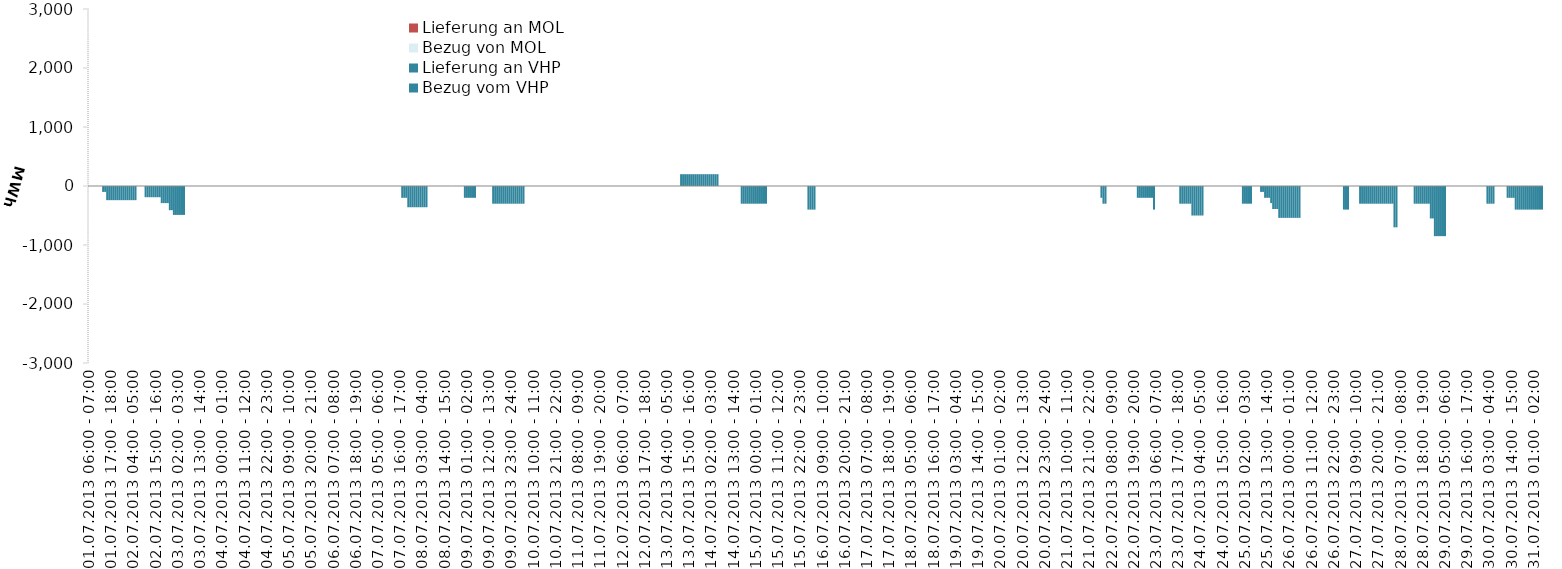
| Category | Bezug vom VHP | Lieferung an VHP | Bezug von MOL | Lieferung an MOL |
|---|---|---|---|---|
| 01.07.2013 06:00 - 07:00 | 0 | 0 | 0 | 0 |
| 01.07.2013 07:00 - 08:00 | 0 | 0 | 0 | 0 |
| 01.07.2013 08:00 - 09:00 | 0 | 0 | 0 | 0 |
| 01.07.2013 09:00 - 10:00 | 0 | 0 | 0 | 0 |
| 01.07.2013 10:00 - 11:00 | 0 | 0 | 0 | 0 |
| 01.07.2013 11:00 - 12:00 | 0 | 0 | 0 | 0 |
| 01.07.2013 12:00 - 13:00 | 0 | 0 | 0 | 0 |
| 01.07.2013 13:00 - 14:00 | 0 | -100 | 0 | 0 |
| 01.07.2013 14:00 - 15:00 | 0 | -100 | 0 | 0 |
| 01.07.2013 15:00 - 16:00 | 0 | -240 | 0 | 0 |
| 01.07.2013 16:00 - 17:00 | 0 | -240 | 0 | 0 |
| 01.07.2013 17:00 - 18:00 | 0 | -240 | 0 | 0 |
| 01.07.2013 18:00 - 19:00 | 0 | -240 | 0 | 0 |
| 01.07.2013 19:00 - 20:00 | 0 | -240 | 0 | 0 |
| 01.07.2013 20:00 - 21:00 | 0 | -240 | 0 | 0 |
| 01.07.2013 21:00 - 22:00 | 0 | -240 | 0 | 0 |
| 01.07.2013 22:00 - 23:00 | 0 | -240 | 0 | 0 |
| 01.07.2013 23:00 - 24:00 | 0 | -240 | 0 | 0 |
| 02.07.2013 00:00 - 01:00 | 0 | -240 | 0 | 0 |
| 02.07.2013 01:00 - 02:00 | 0 | -240 | 0 | 0 |
| 02.07.2013 02:00 - 03:00 | 0 | -240 | 0 | 0 |
| 02.07.2013 03:00 - 04:00 | 0 | -240 | 0 | 0 |
| 02.07.2013 04:00 - 05:00 | 0 | -240 | 0 | 0 |
| 02.07.2013 05:00 - 06:00 | 0 | -240 | 0 | 0 |
| 02.07.2013 06:00 - 07:00 | 0 | 0 | 0 | 0 |
| 02.07.2013 07:00 - 08:00 | 0 | 0 | 0 | 0 |
| 02.07.2013 08:00 - 09:00 | 0 | 0 | 0 | 0 |
| 02.07.2013 09:00 - 10:00 | 0 | 0 | 0 | 0 |
| 02.07.2013 10:00 - 11:00 | 0 | -190 | 0 | 0 |
| 02.07.2013 11:00 - 12:00 | 0 | -190 | 0 | 0 |
| 02.07.2013 12:00 - 13:00 | 0 | -190 | 0 | 0 |
| 02.07.2013 13:00 - 14:00 | 0 | -190 | 0 | 0 |
| 02.07.2013 14:00 - 15:00 | 0 | -190 | 0 | 0 |
| 02.07.2013 15:00 - 16:00 | 0 | -190 | 0 | 0 |
| 02.07.2013 16:00 - 17:00 | 0 | -190 | 0 | 0 |
| 02.07.2013 17:00 - 18:00 | 0 | -190 | 0 | 0 |
| 02.07.2013 18:00 - 19:00 | 0 | -290 | 0 | 0 |
| 02.07.2013 19:00 - 20:00 | 0 | -290 | 0 | 0 |
| 02.07.2013 20:00 - 21:00 | 0 | -290 | 0 | 0 |
| 02.07.2013 21:00 - 22:00 | 0 | -290 | 0 | 0 |
| 02.07.2013 22:00 - 23:00 | 0 | -410 | 0 | 0 |
| 02.07.2013 23:00 - 24:00 | 0 | -410 | 0 | 0 |
| 03.07.2013 00:00 - 01:00 | 0 | -490 | 0 | 0 |
| 03.07.2013 01:00 - 02:00 | 0 | -490 | 0 | 0 |
| 03.07.2013 02:00 - 03:00 | 0 | -490 | 0 | 0 |
| 03.07.2013 03:00 - 04:00 | 0 | -490 | 0 | 0 |
| 03.07.2013 04:00 - 05:00 | 0 | -490 | 0 | 0 |
| 03.07.2013 05:00 - 06:00 | 0 | -490 | 0 | 0 |
| 03.07.2013 06:00 - 07:00 | 0 | 0 | 0 | 0 |
| 03.07.2013 07:00 - 08:00 | 0 | 0 | 0 | 0 |
| 03.07.2013 08:00 - 09:00 | 0 | 0 | 0 | 0 |
| 03.07.2013 09:00 - 10:00 | 0 | 0 | 0 | 0 |
| 03.07.2013 10:00 - 11:00 | 0 | 0 | 0 | 0 |
| 03.07.2013 11:00 - 12:00 | 0 | 0 | 0 | 0 |
| 03.07.2013 12:00 - 13:00 | 0 | 0 | 0 | 0 |
| 03.07.2013 13:00 - 14:00 | 0 | 0 | 0 | 0 |
| 03.07.2013 14:00 - 15:00 | 0 | 0 | 0 | 0 |
| 03.07.2013 15:00 - 16:00 | 0 | 0 | 0 | 0 |
| 03.07.2013 16:00 - 17:00 | 0 | 0 | 0 | 0 |
| 03.07.2013 17:00 - 18:00 | 0 | 0 | 0 | 0 |
| 03.07.2013 18:00 - 19:00 | 0 | 0 | 0 | 0 |
| 03.07.2013 19:00 - 20:00 | 0 | 0 | 0 | 0 |
| 03.07.2013 20:00 - 21:00 | 0 | 0 | 0 | 0 |
| 03.07.2013 21:00 - 22:00 | 0 | 0 | 0 | 0 |
| 03.07.2013 22:00 - 23:00 | 0 | 0 | 0 | 0 |
| 03.07.2013 23:00 - 24:00 | 0 | 0 | 0 | 0 |
| 04.07.2013 00:00 - 01:00 | 0 | 0 | 0 | 0 |
| 04.07.2013 01:00 - 02:00 | 0 | 0 | 0 | 0 |
| 04.07.2013 02:00 - 03:00 | 0 | 0 | 0 | 0 |
| 04.07.2013 03:00 - 04:00 | 0 | 0 | 0 | 0 |
| 04.07.2013 04:00 - 05:00 | 0 | 0 | 0 | 0 |
| 04.07.2013 05:00 - 06:00 | 0 | 0 | 0 | 0 |
| 04.07.2013 06:00 - 07:00 | 0 | 0 | 0 | 0 |
| 04.07.2013 07:00 - 08:00 | 0 | 0 | 0 | 0 |
| 04.07.2013 08:00 - 09:00 | 0 | 0 | 0 | 0 |
| 04.07.2013 09:00 - 10:00 | 0 | 0 | 0 | 0 |
| 04.07.2013 10:00 - 11:00 | 0 | 0 | 0 | 0 |
| 04.07.2013 11:00 - 12:00 | 0 | 0 | 0 | 0 |
| 04.07.2013 12:00 - 13:00 | 0 | 0 | 0 | 0 |
| 04.07.2013 13:00 - 14:00 | 0 | 0 | 0 | 0 |
| 04.07.2013 14:00 - 15:00 | 0 | 0 | 0 | 0 |
| 04.07.2013 15:00 - 16:00 | 0 | 0 | 0 | 0 |
| 04.07.2013 16:00 - 17:00 | 0 | 0 | 0 | 0 |
| 04.07.2013 17:00 - 18:00 | 0 | 0 | 0 | 0 |
| 04.07.2013 18:00 - 19:00 | 0 | 0 | 0 | 0 |
| 04.07.2013 19:00 - 20:00 | 0 | 0 | 0 | 0 |
| 04.07.2013 20:00 - 21:00 | 0 | 0 | 0 | 0 |
| 04.07.2013 21:00 - 22:00 | 0 | 0 | 0 | 0 |
| 04.07.2013 22:00 - 23:00 | 0 | 0 | 0 | 0 |
| 04.07.2013 23:00 - 24:00 | 0 | 0 | 0 | 0 |
| 05.07.2013 00:00 - 01:00 | 0 | 0 | 0 | 0 |
| 05.07.2013 01:00 - 02:00 | 0 | 0 | 0 | 0 |
| 05.07.2013 02:00 - 03:00 | 0 | 0 | 0 | 0 |
| 05.07.2013 03:00 - 04:00 | 0 | 0 | 0 | 0 |
| 05.07.2013 04:00 - 05:00 | 0 | 0 | 0 | 0 |
| 05.07.2013 05:00 - 06:00 | 0 | 0 | 0 | 0 |
| 05.07.2013 06:00 - 07:00 | 0 | 0 | 0 | 0 |
| 05.07.2013 07:00 - 08:00 | 0 | 0 | 0 | 0 |
| 05.07.2013 08:00 - 09:00 | 0 | 0 | 0 | 0 |
| 05.07.2013 09:00 - 10:00 | 0 | 0 | 0 | 0 |
| 05.07.2013 10:00 - 11:00 | 0 | 0 | 0 | 0 |
| 05.07.2013 11:00 - 12:00 | 0 | 0 | 0 | 0 |
| 05.07.2013 12:00 - 13:00 | 0 | 0 | 0 | 0 |
| 05.07.2013 13:00 - 14:00 | 0 | 0 | 0 | 0 |
| 05.07.2013 14:00 - 15:00 | 0 | 0 | 0 | 0 |
| 05.07.2013 15:00 - 16:00 | 0 | 0 | 0 | 0 |
| 05.07.2013 16:00 - 17:00 | 0 | 0 | 0 | 0 |
| 05.07.2013 17:00 - 18:00 | 0 | 0 | 0 | 0 |
| 05.07.2013 18:00 - 19:00 | 0 | 0 | 0 | 0 |
| 05.07.2013 19:00 - 20:00 | 0 | 0 | 0 | 0 |
| 05.07.2013 20:00 - 21:00 | 0 | 0 | 0 | 0 |
| 05.07.2013 21:00 - 22:00 | 0 | 0 | 0 | 0 |
| 05.07.2013 22:00 - 23:00 | 0 | 0 | 0 | 0 |
| 05.07.2013 23:00 - 24:00 | 0 | 0 | 0 | 0 |
| 06.07.2013 00:00 - 01:00 | 0 | 0 | 0 | 0 |
| 06.07.2013 01:00 - 02:00 | 0 | 0 | 0 | 0 |
| 06.07.2013 02:00 - 03:00 | 0 | 0 | 0 | 0 |
| 06.07.2013 03:00 - 04:00 | 0 | 0 | 0 | 0 |
| 06.07.2013 04:00 - 05:00 | 0 | 0 | 0 | 0 |
| 06.07.2013 05:00 - 06:00 | 0 | 0 | 0 | 0 |
| 06.07.2013 06:00 - 07:00 | 0 | 0 | 0 | 0 |
| 06.07.2013 07:00 - 08:00 | 0 | 0 | 0 | 0 |
| 06.07.2013 08:00 - 09:00 | 0 | 0 | 0 | 0 |
| 06.07.2013 09:00 - 10:00 | 0 | 0 | 0 | 0 |
| 06.07.2013 10:00 - 11:00 | 0 | 0 | 0 | 0 |
| 06.07.2013 11:00 - 12:00 | 0 | 0 | 0 | 0 |
| 06.07.2013 12:00 - 13:00 | 0 | 0 | 0 | 0 |
| 06.07.2013 13:00 - 14:00 | 0 | 0 | 0 | 0 |
| 06.07.2013 14:00 - 15:00 | 0 | 0 | 0 | 0 |
| 06.07.2013 15:00 - 16:00 | 0 | 0 | 0 | 0 |
| 06.07.2013 16:00 - 17:00 | 0 | 0 | 0 | 0 |
| 06.07.2013 17:00 - 18:00 | 0 | 0 | 0 | 0 |
| 06.07.2013 18:00 - 19:00 | 0 | 0 | 0 | 0 |
| 06.07.2013 19:00 - 20:00 | 0 | 0 | 0 | 0 |
| 06.07.2013 20:00 - 21:00 | 0 | 0 | 0 | 0 |
| 06.07.2013 21:00 - 22:00 | 0 | 0 | 0 | 0 |
| 06.07.2013 22:00 - 23:00 | 0 | 0 | 0 | 0 |
| 06.07.2013 23:00 - 24:00 | 0 | 0 | 0 | 0 |
| 07.07.2013 00:00 - 01:00 | 0 | 0 | 0 | 0 |
| 07.07.2013 01:00 - 02:00 | 0 | 0 | 0 | 0 |
| 07.07.2013 02:00 - 03:00 | 0 | 0 | 0 | 0 |
| 07.07.2013 03:00 - 04:00 | 0 | 0 | 0 | 0 |
| 07.07.2013 04:00 - 05:00 | 0 | 0 | 0 | 0 |
| 07.07.2013 05:00 - 06:00 | 0 | 0 | 0 | 0 |
| 07.07.2013 06:00 - 07:00 | 0 | 0 | 0 | 0 |
| 07.07.2013 07:00 - 08:00 | 0 | 0 | 0 | 0 |
| 07.07.2013 08:00 - 09:00 | 0 | 0 | 0 | 0 |
| 07.07.2013 09:00 - 10:00 | 0 | 0 | 0 | 0 |
| 07.07.2013 10:00 - 11:00 | 0 | 0 | 0 | 0 |
| 07.07.2013 11:00 - 12:00 | 0 | 0 | 0 | 0 |
| 07.07.2013 12:00 - 13:00 | 0 | 0 | 0 | 0 |
| 07.07.2013 13:00 - 14:00 | 0 | 0 | 0 | 0 |
| 07.07.2013 14:00 - 15:00 | 0 | 0 | 0 | 0 |
| 07.07.2013 15:00 - 16:00 | 0 | 0 | 0 | 0 |
| 07.07.2013 16:00 - 17:00 | 0 | 0 | 0 | 0 |
| 07.07.2013 17:00 - 18:00 | 0 | -200 | 0 | 0 |
| 07.07.2013 18:00 - 19:00 | 0 | -200 | 0 | 0 |
| 07.07.2013 19:00 - 20:00 | 0 | -200 | 0 | 0 |
| 07.07.2013 20:00 - 21:00 | 0 | -360 | 0 | 0 |
| 07.07.2013 21:00 - 22:00 | 0 | -360 | 0 | 0 |
| 07.07.2013 22:00 - 23:00 | 0 | -360 | 0 | 0 |
| 07.07.2013 23:00 - 24:00 | 0 | -360 | 0 | 0 |
| 08.07.2013 00:00 - 01:00 | 0 | -360 | 0 | 0 |
| 08.07.2013 01:00 - 02:00 | 0 | -360 | 0 | 0 |
| 08.07.2013 02:00 - 03:00 | 0 | -360 | 0 | 0 |
| 08.07.2013 03:00 - 04:00 | 0 | -360 | 0 | 0 |
| 08.07.2013 04:00 - 05:00 | 0 | -360 | 0 | 0 |
| 08.07.2013 05:00 - 06:00 | 0 | -360 | 0 | 0 |
| 08.07.2013 06:00 - 07:00 | 0 | 0 | 0 | 0 |
| 08.07.2013 07:00 - 08:00 | 0 | 0 | 0 | 0 |
| 08.07.2013 08:00 - 09:00 | 0 | 0 | 0 | 0 |
| 08.07.2013 09:00 - 10:00 | 0 | 0 | 0 | 0 |
| 08.07.2013 10:00 - 11:00 | 0 | 0 | 0 | 0 |
| 08.07.2013 11:00 - 12:00 | 0 | 0 | 0 | 0 |
| 08.07.2013 12:00 - 13:00 | 0 | 0 | 0 | 0 |
| 08.07.2013 13:00 - 14:00 | 0 | 0 | 0 | 0 |
| 08.07.2013 14:00 - 15:00 | 0 | 0 | 0 | 0 |
| 08.07.2013 15:00 - 16:00 | 0 | 0 | 0 | 0 |
| 08.07.2013 16:00 - 17:00 | 0 | 0 | 0 | 0 |
| 08.07.2013 17:00 - 18:00 | 0 | 0 | 0 | 0 |
| 08.07.2013 18:00 - 19:00 | 0 | 0 | 0 | 0 |
| 08.07.2013 19:00 - 20:00 | 0 | 0 | 0 | 0 |
| 08.07.2013 20:00 - 21:00 | 0 | 0 | 0 | 0 |
| 08.07.2013 21:00 - 22:00 | 0 | 0 | 0 | 0 |
| 08.07.2013 22:00 - 23:00 | 0 | 0 | 0 | 0 |
| 08.07.2013 23:00 - 24:00 | 0 | 0 | 0 | 0 |
| 09.07.2013 00:00 - 01:00 | 0 | -200 | 0 | 0 |
| 09.07.2013 01:00 - 02:00 | 0 | -200 | 0 | 0 |
| 09.07.2013 02:00 - 03:00 | 0 | -200 | 0 | 0 |
| 09.07.2013 03:00 - 04:00 | 0 | -200 | 0 | 0 |
| 09.07.2013 04:00 - 05:00 | 0 | -200 | 0 | 0 |
| 09.07.2013 05:00 - 06:00 | 0 | -200 | 0 | 0 |
| 09.07.2013 06:00 - 07:00 | 0 | 0 | 0 | 0 |
| 09.07.2013 07:00 - 08:00 | 0 | 0 | 0 | 0 |
| 09.07.2013 08:00 - 09:00 | 0 | 0 | 0 | 0 |
| 09.07.2013 09:00 - 10:00 | 0 | 0 | 0 | 0 |
| 09.07.2013 10:00 - 11:00 | 0 | 0 | 0 | 0 |
| 09.07.2013 11:00 - 12:00 | 0 | 0 | 0 | 0 |
| 09.07.2013 12:00 - 13:00 | 0 | 0 | 0 | 0 |
| 09.07.2013 13:00 - 14:00 | 0 | 0 | 0 | 0 |
| 09.07.2013 14:00 - 15:00 | 0 | -300 | 0 | 0 |
| 09.07.2013 15:00 - 16:00 | 0 | -300 | 0 | 0 |
| 09.07.2013 16:00 - 17:00 | 0 | -300 | 0 | 0 |
| 09.07.2013 17:00 - 18:00 | 0 | -300 | 0 | 0 |
| 09.07.2013 18:00 - 19:00 | 0 | -300 | 0 | 0 |
| 09.07.2013 19:00 - 20:00 | 0 | -300 | 0 | 0 |
| 09.07.2013 20:00 - 21:00 | 0 | -300 | 0 | 0 |
| 09.07.2013 21:00 - 22:00 | 0 | -300 | 0 | 0 |
| 09.07.2013 22:00 - 23:00 | 0 | -300 | 0 | 0 |
| 09.07.2013 23:00 - 24:00 | 0 | -300 | 0 | 0 |
| 10.07.2013 00:00 - 01:00 | 0 | -300 | 0 | 0 |
| 10.07.2013 01:00 - 02:00 | 0 | -300 | 0 | 0 |
| 10.07.2013 02:00 - 03:00 | 0 | -300 | 0 | 0 |
| 10.07.2013 03:00 - 04:00 | 0 | -300 | 0 | 0 |
| 10.07.2013 04:00 - 05:00 | 0 | -300 | 0 | 0 |
| 10.07.2013 05:00 - 06:00 | 0 | -300 | 0 | 0 |
| 10.07.2013 06:00 - 07:00 | 0 | 0 | 0 | 0 |
| 10.07.2013 07:00 - 08:00 | 0 | 0 | 0 | 0 |
| 10.07.2013 08:00 - 09:00 | 0 | 0 | 0 | 0 |
| 10.07.2013 09:00 - 10:00 | 0 | 0 | 0 | 0 |
| 10.07.2013 10:00 - 11:00 | 0 | 0 | 0 | 0 |
| 10.07.2013 11:00 - 12:00 | 0 | 0 | 0 | 0 |
| 10.07.2013 12:00 - 13:00 | 0 | 0 | 0 | 0 |
| 10.07.2013 13:00 - 14:00 | 0 | 0 | 0 | 0 |
| 10.07.2013 14:00 - 15:00 | 0 | 0 | 0 | 0 |
| 10.07.2013 15:00 - 16:00 | 0 | 0 | 0 | 0 |
| 10.07.2013 16:00 - 17:00 | 0 | 0 | 0 | 0 |
| 10.07.2013 17:00 - 18:00 | 0 | 0 | 0 | 0 |
| 10.07.2013 18:00 - 19:00 | 0 | 0 | 0 | 0 |
| 10.07.2013 19:00 - 20:00 | 0 | 0 | 0 | 0 |
| 10.07.2013 20:00 - 21:00 | 0 | 0 | 0 | 0 |
| 10.07.2013 21:00 - 22:00 | 0 | 0 | 0 | 0 |
| 10.07.2013 22:00 - 23:00 | 0 | 0 | 0 | 0 |
| 10.07.2013 23:00 - 24:00 | 0 | 0 | 0 | 0 |
| 11.07.2013 00:00 - 01:00 | 0 | 0 | 0 | 0 |
| 11.07.2013 01:00 - 02:00 | 0 | 0 | 0 | 0 |
| 11.07.2013 02:00 - 03:00 | 0 | 0 | 0 | 0 |
| 11.07.2013 03:00 - 04:00 | 0 | 0 | 0 | 0 |
| 11.07.2013 04:00 - 05:00 | 0 | 0 | 0 | 0 |
| 11.07.2013 05:00 - 06:00 | 0 | 0 | 0 | 0 |
| 11.07.2013 06:00 - 07:00 | 0 | 0 | 0 | 0 |
| 11.07.2013 07:00 - 08:00 | 0 | 0 | 0 | 0 |
| 11.07.2013 08:00 - 09:00 | 0 | 0 | 0 | 0 |
| 11.07.2013 09:00 - 10:00 | 0 | 0 | 0 | 0 |
| 11.07.2013 10:00 - 11:00 | 0 | 0 | 0 | 0 |
| 11.07.2013 11:00 - 12:00 | 0 | 0 | 0 | 0 |
| 11.07.2013 12:00 - 13:00 | 0 | 0 | 0 | 0 |
| 11.07.2013 13:00 - 14:00 | 0 | 0 | 0 | 0 |
| 11.07.2013 14:00 - 15:00 | 0 | 0 | 0 | 0 |
| 11.07.2013 15:00 - 16:00 | 0 | 0 | 0 | 0 |
| 11.07.2013 16:00 - 17:00 | 0 | 0 | 0 | 0 |
| 11.07.2013 17:00 - 18:00 | 0 | 0 | 0 | 0 |
| 11.07.2013 18:00 - 19:00 | 0 | 0 | 0 | 0 |
| 11.07.2013 19:00 - 20:00 | 0 | 0 | 0 | 0 |
| 11.07.2013 20:00 - 21:00 | 0 | 0 | 0 | 0 |
| 11.07.2013 21:00 - 22:00 | 0 | 0 | 0 | 0 |
| 11.07.2013 22:00 - 23:00 | 0 | 0 | 0 | 0 |
| 11.07.2013 23:00 - 24:00 | 0 | 0 | 0 | 0 |
| 12.07.2013 00:00 - 01:00 | 0 | 0 | 0 | 0 |
| 12.07.2013 01:00 - 02:00 | 0 | 0 | 0 | 0 |
| 12.07.2013 02:00 - 03:00 | 0 | 0 | 0 | 0 |
| 12.07.2013 03:00 - 04:00 | 0 | 0 | 0 | 0 |
| 12.07.2013 04:00 - 05:00 | 0 | 0 | 0 | 0 |
| 12.07.2013 05:00 - 06:00 | 0 | 0 | 0 | 0 |
| 12.07.2013 06:00 - 07:00 | 0 | 0 | 0 | 0 |
| 12.07.2013 07:00 - 08:00 | 0 | 0 | 0 | 0 |
| 12.07.2013 08:00 - 09:00 | 0 | 0 | 0 | 0 |
| 12.07.2013 09:00 - 10:00 | 0 | 0 | 0 | 0 |
| 12.07.2013 10:00 - 11:00 | 0 | 0 | 0 | 0 |
| 12.07.2013 11:00 - 12:00 | 0 | 0 | 0 | 0 |
| 12.07.2013 12:00 - 13:00 | 0 | 0 | 0 | 0 |
| 12.07.2013 13:00 - 14:00 | 0 | 0 | 0 | 0 |
| 12.07.2013 14:00 - 15:00 | 0 | 0 | 0 | 0 |
| 12.07.2013 15:00 - 16:00 | 0 | 0 | 0 | 0 |
| 12.07.2013 16:00 - 17:00 | 0 | 0 | 0 | 0 |
| 12.07.2013 17:00 - 18:00 | 0 | 0 | 0 | 0 |
| 12.07.2013 18:00 - 19:00 | 0 | 0 | 0 | 0 |
| 12.07.2013 19:00 - 20:00 | 0 | 0 | 0 | 0 |
| 12.07.2013 20:00 - 21:00 | 0 | 0 | 0 | 0 |
| 12.07.2013 21:00 - 22:00 | 0 | 0 | 0 | 0 |
| 12.07.2013 22:00 - 23:00 | 0 | 0 | 0 | 0 |
| 12.07.2013 23:00 - 24:00 | 0 | 0 | 0 | 0 |
| 13.07.2013 00:00 - 01:00 | 0 | 0 | 0 | 0 |
| 13.07.2013 01:00 - 02:00 | 0 | 0 | 0 | 0 |
| 13.07.2013 02:00 - 03:00 | 0 | 0 | 0 | 0 |
| 13.07.2013 03:00 - 04:00 | 0 | 0 | 0 | 0 |
| 13.07.2013 04:00 - 05:00 | 0 | 0 | 0 | 0 |
| 13.07.2013 05:00 - 06:00 | 0 | 0 | 0 | 0 |
| 13.07.2013 06:00 - 07:00 | 0 | 0 | 0 | 0 |
| 13.07.2013 07:00 - 08:00 | 0 | 0 | 0 | 0 |
| 13.07.2013 08:00 - 09:00 | 0 | 0 | 0 | 0 |
| 13.07.2013 09:00 - 10:00 | 0 | 0 | 0 | 0 |
| 13.07.2013 10:00 - 11:00 | 0 | 0 | 0 | 0 |
| 13.07.2013 11:00 - 12:00 | 200 | 0 | 0 | 0 |
| 13.07.2013 12:00 - 13:00 | 200 | 0 | 0 | 0 |
| 13.07.2013 13:00 - 14:00 | 200 | 0 | 0 | 0 |
| 13.07.2013 14:00 - 15:00 | 200 | 0 | 0 | 0 |
| 13.07.2013 15:00 - 16:00 | 200 | 0 | 0 | 0 |
| 13.07.2013 16:00 - 17:00 | 200 | 0 | 0 | 0 |
| 13.07.2013 17:00 - 18:00 | 200 | 0 | 0 | 0 |
| 13.07.2013 18:00 - 19:00 | 200 | 0 | 0 | 0 |
| 13.07.2013 19:00 - 20:00 | 200 | 0 | 0 | 0 |
| 13.07.2013 20:00 - 21:00 | 200 | 0 | 0 | 0 |
| 13.07.2013 21:00 - 22:00 | 200 | 0 | 0 | 0 |
| 13.07.2013 22:00 - 23:00 | 200 | 0 | 0 | 0 |
| 13.07.2013 23:00 - 24:00 | 200 | 0 | 0 | 0 |
| 14.07.2013 00:00 - 01:00 | 200 | 0 | 0 | 0 |
| 14.07.2013 01:00 - 02:00 | 200 | 0 | 0 | 0 |
| 14.07.2013 02:00 - 03:00 | 200 | 0 | 0 | 0 |
| 14.07.2013 03:00 - 04:00 | 200 | 0 | 0 | 0 |
| 14.07.2013 04:00 - 05:00 | 200 | 0 | 0 | 0 |
| 14.07.2013 05:00 - 06:00 | 200 | 0 | 0 | 0 |
| 14.07.2013 06:00 - 07:00 | 0 | 0 | 0 | 0 |
| 14.07.2013 07:00 - 08:00 | 0 | 0 | 0 | 0 |
| 14.07.2013 08:00 - 09:00 | 0 | 0 | 0 | 0 |
| 14.07.2013 09:00 - 10:00 | 0 | 0 | 0 | 0 |
| 14.07.2013 10:00 - 11:00 | 0 | 0 | 0 | 0 |
| 14.07.2013 11:00 - 12:00 | 0 | 0 | 0 | 0 |
| 14.07.2013 12:00 - 13:00 | 0 | 0 | 0 | 0 |
| 14.07.2013 13:00 - 14:00 | 0 | 0 | 0 | 0 |
| 14.07.2013 14:00 - 15:00 | 0 | 0 | 0 | 0 |
| 14.07.2013 15:00 - 16:00 | 0 | 0 | 0 | 0 |
| 14.07.2013 16:00 - 17:00 | 0 | 0 | 0 | 0 |
| 14.07.2013 17:00 - 18:00 | 0 | -300 | 0 | 0 |
| 14.07.2013 18:00 - 19:00 | 0 | -300 | 0 | 0 |
| 14.07.2013 19:00 - 20:00 | 0 | -300 | 0 | 0 |
| 14.07.2013 20:00 - 21:00 | 0 | -300 | 0 | 0 |
| 14.07.2013 21:00 - 22:00 | 0 | -300 | 0 | 0 |
| 14.07.2013 22:00 - 23:00 | 0 | -300 | 0 | 0 |
| 14.07.2013 23:00 - 24:00 | 0 | -300 | 0 | 0 |
| 15.07.2013 00:00 - 01:00 | 0 | -300 | 0 | 0 |
| 15.07.2013 01:00 - 02:00 | 0 | -300 | 0 | 0 |
| 15.07.2013 02:00 - 03:00 | 0 | -300 | 0 | 0 |
| 15.07.2013 03:00 - 04:00 | 0 | -300 | 0 | 0 |
| 15.07.2013 04:00 - 05:00 | 0 | -300 | 0 | 0 |
| 15.07.2013 05:00 - 06:00 | 0 | -300 | 0 | 0 |
| 15.07.2013 06:00 - 07:00 | 0 | 0 | 0 | 0 |
| 15.07.2013 07:00 - 08:00 | 0 | 0 | 0 | 0 |
| 15.07.2013 08:00 - 09:00 | 0 | 0 | 0 | 0 |
| 15.07.2013 09:00 - 10:00 | 0 | 0 | 0 | 0 |
| 15.07.2013 10:00 - 11:00 | 0 | 0 | 0 | 0 |
| 15.07.2013 11:00 - 12:00 | 0 | 0 | 0 | 0 |
| 15.07.2013 12:00 - 13:00 | 0 | 0 | 0 | 0 |
| 15.07.2013 13:00 - 14:00 | 0 | 0 | 0 | 0 |
| 15.07.2013 14:00 - 15:00 | 0 | 0 | 0 | 0 |
| 15.07.2013 15:00 - 16:00 | 0 | 0 | 0 | 0 |
| 15.07.2013 16:00 - 17:00 | 0 | 0 | 0 | 0 |
| 15.07.2013 17:00 - 18:00 | 0 | 0 | 0 | 0 |
| 15.07.2013 18:00 - 19:00 | 0 | 0 | 0 | 0 |
| 15.07.2013 19:00 - 20:00 | 0 | 0 | 0 | 0 |
| 15.07.2013 20:00 - 21:00 | 0 | 0 | 0 | 0 |
| 15.07.2013 21:00 - 22:00 | 0 | 0 | 0 | 0 |
| 15.07.2013 22:00 - 23:00 | 0 | 0 | 0 | 0 |
| 15.07.2013 23:00 - 24:00 | 0 | 0 | 0 | 0 |
| 16.07.2013 00:00 - 01:00 | 0 | 0 | 0 | 0 |
| 16.07.2013 01:00 - 02:00 | 0 | 0 | 0 | 0 |
| 16.07.2013 02:00 - 03:00 | 0 | -400 | 0 | 0 |
| 16.07.2013 03:00 - 04:00 | 0 | -400 | 0 | 0 |
| 16.07.2013 04:00 - 05:00 | 0 | -400 | 0 | 0 |
| 16.07.2013 05:00 - 06:00 | 0 | -400 | 0 | 0 |
| 16.07.2013 06:00 - 07:00 | 0 | 0 | 0 | 0 |
| 16.07.2013 07:00 - 08:00 | 0 | 0 | 0 | 0 |
| 16.07.2013 08:00 - 09:00 | 0 | 0 | 0 | 0 |
| 16.07.2013 09:00 - 10:00 | 0 | 0 | 0 | 0 |
| 16.07.2013 10:00 - 11:00 | 0 | 0 | 0 | 0 |
| 16.07.2013 11:00 - 12:00 | 0 | 0 | 0 | 0 |
| 16.07.2013 12:00 - 13:00 | 0 | 0 | 0 | 0 |
| 16.07.2013 13:00 - 14:00 | 0 | 0 | 0 | 0 |
| 16.07.2013 14:00 - 15:00 | 0 | 0 | 0 | 0 |
| 16.07.2013 15:00 - 16:00 | 0 | 0 | 0 | 0 |
| 16.07.2013 16:00 - 17:00 | 0 | 0 | 0 | 0 |
| 16.07.2013 17:00 - 18:00 | 0 | 0 | 0 | 0 |
| 16.07.2013 18:00 - 19:00 | 0 | 0 | 0 | 0 |
| 16.07.2013 19:00 - 20:00 | 0 | 0 | 0 | 0 |
| 16.07.2013 20:00 - 21:00 | 0 | 0 | 0 | 0 |
| 16.07.2013 21:00 - 22:00 | 0 | 0 | 0 | 0 |
| 16.07.2013 22:00 - 23:00 | 0 | 0 | 0 | 0 |
| 16.07.2013 23:00 - 24:00 | 0 | 0 | 0 | 0 |
| 17.07.2013 00:00 - 01:00 | 0 | 0 | 0 | 0 |
| 17.07.2013 01:00 - 02:00 | 0 | 0 | 0 | 0 |
| 17.07.2013 02:00 - 03:00 | 0 | 0 | 0 | 0 |
| 17.07.2013 03:00 - 04:00 | 0 | 0 | 0 | 0 |
| 17.07.2013 04:00 - 05:00 | 0 | 0 | 0 | 0 |
| 17.07.2013 05:00 - 06:00 | 0 | 0 | 0 | 0 |
| 17.07.2013 06:00 - 07:00 | 0 | 0 | 0 | 0 |
| 17.07.2013 07:00 - 08:00 | 0 | 0 | 0 | 0 |
| 17.07.2013 08:00 - 09:00 | 0 | 0 | 0 | 0 |
| 17.07.2013 09:00 - 10:00 | 0 | 0 | 0 | 0 |
| 17.07.2013 10:00 - 11:00 | 0 | 0 | 0 | 0 |
| 17.07.2013 11:00 - 12:00 | 0 | 0 | 0 | 0 |
| 17.07.2013 12:00 - 13:00 | 0 | 0 | 0 | 0 |
| 17.07.2013 13:00 - 14:00 | 0 | 0 | 0 | 0 |
| 17.07.2013 14:00 - 15:00 | 0 | 0 | 0 | 0 |
| 17.07.2013 15:00 - 16:00 | 0 | 0 | 0 | 0 |
| 17.07.2013 16:00 - 17:00 | 0 | 0 | 0 | 0 |
| 17.07.2013 17:00 - 18:00 | 0 | 0 | 0 | 0 |
| 17.07.2013 18:00 - 19:00 | 0 | 0 | 0 | 0 |
| 17.07.2013 19:00 - 20:00 | 0 | 0 | 0 | 0 |
| 17.07.2013 20:00 - 21:00 | 0 | 0 | 0 | 0 |
| 17.07.2013 21:00 - 22:00 | 0 | 0 | 0 | 0 |
| 17.07.2013 22:00 - 23:00 | 0 | 0 | 0 | 0 |
| 17.07.2013 23:00 - 24:00 | 0 | 0 | 0 | 0 |
| 18.07.2013 00:00 - 01:00 | 0 | 0 | 0 | 0 |
| 18.07.2013 01:00 - 02:00 | 0 | 0 | 0 | 0 |
| 18.07.2013 02:00 - 03:00 | 0 | 0 | 0 | 0 |
| 18.07.2013 03:00 - 04:00 | 0 | 0 | 0 | 0 |
| 18.07.2013 04:00 - 05:00 | 0 | 0 | 0 | 0 |
| 18.07.2013 05:00 - 06:00 | 0 | 0 | 0 | 0 |
| 18.07.2013 06:00 - 07:00 | 0 | 0 | 0 | 0 |
| 18.07.2013 07:00 - 08:00 | 0 | 0 | 0 | 0 |
| 18.07.2013 08:00 - 09:00 | 0 | 0 | 0 | 0 |
| 18.07.2013 09:00 - 10:00 | 0 | 0 | 0 | 0 |
| 18.07.2013 10:00 - 11:00 | 0 | 0 | 0 | 0 |
| 18.07.2013 11:00 - 12:00 | 0 | 0 | 0 | 0 |
| 18.07.2013 12:00 - 13:00 | 0 | 0 | 0 | 0 |
| 18.07.2013 13:00 - 14:00 | 0 | 0 | 0 | 0 |
| 18.07.2013 14:00 - 15:00 | 0 | 0 | 0 | 0 |
| 18.07.2013 15:00 - 16:00 | 0 | 0 | 0 | 0 |
| 18.07.2013 16:00 - 17:00 | 0 | 0 | 0 | 0 |
| 18.07.2013 17:00 - 18:00 | 0 | 0 | 0 | 0 |
| 18.07.2013 18:00 - 19:00 | 0 | 0 | 0 | 0 |
| 18.07.2013 19:00 - 20:00 | 0 | 0 | 0 | 0 |
| 18.07.2013 20:00 - 21:00 | 0 | 0 | 0 | 0 |
| 18.07.2013 21:00 - 22:00 | 0 | 0 | 0 | 0 |
| 18.07.2013 22:00 - 23:00 | 0 | 0 | 0 | 0 |
| 18.07.2013 23:00 - 24:00 | 0 | 0 | 0 | 0 |
| 19.07.2013 00:00 - 01:00 | 0 | 0 | 0 | 0 |
| 19.07.2013 01:00 - 02:00 | 0 | 0 | 0 | 0 |
| 19.07.2013 02:00 - 03:00 | 0 | 0 | 0 | 0 |
| 19.07.2013 03:00 - 04:00 | 0 | 0 | 0 | 0 |
| 19.07.2013 04:00 - 05:00 | 0 | 0 | 0 | 0 |
| 19.07.2013 05:00 - 06:00 | 0 | 0 | 0 | 0 |
| 19.07.2013 06:00 - 07:00 | 0 | 0 | 0 | 0 |
| 19.07.2013 07:00 - 08:00 | 0 | 0 | 0 | 0 |
| 19.07.2013 08:00 - 09:00 | 0 | 0 | 0 | 0 |
| 19.07.2013 09:00 - 10:00 | 0 | 0 | 0 | 0 |
| 19.07.2013 10:00 - 11:00 | 0 | 0 | 0 | 0 |
| 19.07.2013 11:00 - 12:00 | 0 | 0 | 0 | 0 |
| 19.07.2013 12:00 - 13:00 | 0 | 0 | 0 | 0 |
| 19.07.2013 13:00 - 14:00 | 0 | 0 | 0 | 0 |
| 19.07.2013 14:00 - 15:00 | 0 | 0 | 0 | 0 |
| 19.07.2013 15:00 - 16:00 | 0 | 0 | 0 | 0 |
| 19.07.2013 16:00 - 17:00 | 0 | 0 | 0 | 0 |
| 19.07.2013 17:00 - 18:00 | 0 | 0 | 0 | 0 |
| 19.07.2013 18:00 - 19:00 | 0 | 0 | 0 | 0 |
| 19.07.2013 19:00 - 20:00 | 0 | 0 | 0 | 0 |
| 19.07.2013 20:00 - 21:00 | 0 | 0 | 0 | 0 |
| 19.07.2013 21:00 - 22:00 | 0 | 0 | 0 | 0 |
| 19.07.2013 22:00 - 23:00 | 0 | 0 | 0 | 0 |
| 19.07.2013 23:00 - 24:00 | 0 | 0 | 0 | 0 |
| 20.07.2013 00:00 - 01:00 | 0 | 0 | 0 | 0 |
| 20.07.2013 01:00 - 02:00 | 0 | 0 | 0 | 0 |
| 20.07.2013 02:00 - 03:00 | 0 | 0 | 0 | 0 |
| 20.07.2013 03:00 - 04:00 | 0 | 0 | 0 | 0 |
| 20.07.2013 04:00 - 05:00 | 0 | 0 | 0 | 0 |
| 20.07.2013 05:00 - 06:00 | 0 | 0 | 0 | 0 |
| 20.07.2013 06:00 - 07:00 | 0 | 0 | 0 | 0 |
| 20.07.2013 07:00 - 08:00 | 0 | 0 | 0 | 0 |
| 20.07.2013 08:00 - 09:00 | 0 | 0 | 0 | 0 |
| 20.07.2013 09:00 - 10:00 | 0 | 0 | 0 | 0 |
| 20.07.2013 10:00 - 11:00 | 0 | 0 | 0 | 0 |
| 20.07.2013 11:00 - 12:00 | 0 | 0 | 0 | 0 |
| 20.07.2013 12:00 - 13:00 | 0 | 0 | 0 | 0 |
| 20.07.2013 13:00 - 14:00 | 0 | 0 | 0 | 0 |
| 20.07.2013 14:00 - 15:00 | 0 | 0 | 0 | 0 |
| 20.07.2013 15:00 - 16:00 | 0 | 0 | 0 | 0 |
| 20.07.2013 16:00 - 17:00 | 0 | 0 | 0 | 0 |
| 20.07.2013 17:00 - 18:00 | 0 | 0 | 0 | 0 |
| 20.07.2013 18:00 - 19:00 | 0 | 0 | 0 | 0 |
| 20.07.2013 19:00 - 20:00 | 0 | 0 | 0 | 0 |
| 20.07.2013 20:00 - 21:00 | 0 | 0 | 0 | 0 |
| 20.07.2013 21:00 - 22:00 | 0 | 0 | 0 | 0 |
| 20.07.2013 22:00 - 23:00 | 0 | 0 | 0 | 0 |
| 20.07.2013 23:00 - 24:00 | 0 | 0 | 0 | 0 |
| 21.07.2013 00:00 - 01:00 | 0 | 0 | 0 | 0 |
| 21.07.2013 01:00 - 02:00 | 0 | 0 | 0 | 0 |
| 21.07.2013 02:00 - 03:00 | 0 | 0 | 0 | 0 |
| 21.07.2013 03:00 - 04:00 | 0 | 0 | 0 | 0 |
| 21.07.2013 04:00 - 05:00 | 0 | 0 | 0 | 0 |
| 21.07.2013 05:00 - 06:00 | 0 | 0 | 0 | 0 |
| 21.07.2013 06:00 - 07:00 | 0 | 0 | 0 | 0 |
| 21.07.2013 07:00 - 08:00 | 0 | 0 | 0 | 0 |
| 21.07.2013 08:00 - 09:00 | 0 | 0 | 0 | 0 |
| 21.07.2013 09:00 - 10:00 | 0 | 0 | 0 | 0 |
| 21.07.2013 10:00 - 11:00 | 0 | 0 | 0 | 0 |
| 21.07.2013 11:00 - 12:00 | 0 | 0 | 0 | 0 |
| 21.07.2013 12:00 - 13:00 | 0 | 0 | 0 | 0 |
| 21.07.2013 13:00 - 14:00 | 0 | 0 | 0 | 0 |
| 21.07.2013 14:00 - 15:00 | 0 | 0 | 0 | 0 |
| 21.07.2013 15:00 - 16:00 | 0 | 0 | 0 | 0 |
| 21.07.2013 16:00 - 17:00 | 0 | 0 | 0 | 0 |
| 21.07.2013 17:00 - 18:00 | 0 | 0 | 0 | 0 |
| 21.07.2013 18:00 - 19:00 | 0 | 0 | 0 | 0 |
| 21.07.2013 19:00 - 20:00 | 0 | 0 | 0 | 0 |
| 21.07.2013 20:00 - 21:00 | 0 | 0 | 0 | 0 |
| 21.07.2013 21:00 - 22:00 | 0 | 0 | 0 | 0 |
| 21.07.2013 22:00 - 23:00 | 0 | 0 | 0 | 0 |
| 21.07.2013 23:00 - 24:00 | 0 | 0 | 0 | 0 |
| 22.07.2013 00:00 - 01:00 | 0 | 0 | 0 | 0 |
| 22.07.2013 01:00 - 02:00 | 0 | 0 | 0 | 0 |
| 22.07.2013 02:00 - 03:00 | 0 | 0 | 0 | 0 |
| 22.07.2013 03:00 - 04:00 | 0 | -200 | 0 | 0 |
| 22.07.2013 04:00 - 05:00 | 0 | -300 | 0 | 0 |
| 22.07.2013 05:00 - 06:00 | 0 | -300 | 0 | 0 |
| 22.07.2013 06:00 - 07:00 | 0 | 0 | 0 | 0 |
| 22.07.2013 07:00 - 08:00 | 0 | 0 | 0 | 0 |
| 22.07.2013 08:00 - 09:00 | 0 | 0 | 0 | 0 |
| 22.07.2013 09:00 - 10:00 | 0 | 0 | 0 | 0 |
| 22.07.2013 10:00 - 11:00 | 0 | 0 | 0 | 0 |
| 22.07.2013 11:00 - 12:00 | 0 | 0 | 0 | 0 |
| 22.07.2013 12:00 - 13:00 | 0 | 0 | 0 | 0 |
| 22.07.2013 13:00 - 14:00 | 0 | 0 | 0 | 0 |
| 22.07.2013 14:00 - 15:00 | 0 | 0 | 0 | 0 |
| 22.07.2013 15:00 - 16:00 | 0 | 0 | 0 | 0 |
| 22.07.2013 16:00 - 17:00 | 0 | 0 | 0 | 0 |
| 22.07.2013 17:00 - 18:00 | 0 | 0 | 0 | 0 |
| 22.07.2013 18:00 - 19:00 | 0 | 0 | 0 | 0 |
| 22.07.2013 19:00 - 20:00 | 0 | 0 | 0 | 0 |
| 22.07.2013 20:00 - 21:00 | 0 | 0 | 0 | 0 |
| 22.07.2013 21:00 - 22:00 | 0 | -200 | 0 | 0 |
| 22.07.2013 22:00 - 23:00 | 0 | -200 | 0 | 0 |
| 22.07.2013 23:00 - 24:00 | 0 | -200 | 0 | 0 |
| 23.07.2013 00:00 - 01:00 | 0 | -200 | 0 | 0 |
| 23.07.2013 01:00 - 02:00 | 0 | -200 | 0 | 0 |
| 23.07.2013 02:00 - 03:00 | 0 | -200 | 0 | 0 |
| 23.07.2013 03:00 - 04:00 | 0 | -200 | 0 | 0 |
| 23.07.2013 04:00 - 05:00 | 0 | -200 | 0 | 0 |
| 23.07.2013 05:00 - 06:00 | 0 | -400 | 0 | 0 |
| 23.07.2013 06:00 - 07:00 | 0 | 0 | 0 | 0 |
| 23.07.2013 07:00 - 08:00 | 0 | 0 | 0 | 0 |
| 23.07.2013 08:00 - 09:00 | 0 | 0 | 0 | 0 |
| 23.07.2013 09:00 - 10:00 | 0 | 0 | 0 | 0 |
| 23.07.2013 10:00 - 11:00 | 0 | 0 | 0 | 0 |
| 23.07.2013 11:00 - 12:00 | 0 | 0 | 0 | 0 |
| 23.07.2013 12:00 - 13:00 | 0 | 0 | 0 | 0 |
| 23.07.2013 13:00 - 14:00 | 0 | 0 | 0 | 0 |
| 23.07.2013 14:00 - 15:00 | 0 | 0 | 0 | 0 |
| 23.07.2013 15:00 - 16:00 | 0 | 0 | 0 | 0 |
| 23.07.2013 16:00 - 17:00 | 0 | 0 | 0 | 0 |
| 23.07.2013 17:00 - 18:00 | 0 | 0 | 0 | 0 |
| 23.07.2013 18:00 - 19:00 | 0 | -300 | 0 | 0 |
| 23.07.2013 19:00 - 20:00 | 0 | -300 | 0 | 0 |
| 23.07.2013 20:00 - 21:00 | 0 | -300 | 0 | 0 |
| 23.07.2013 21:00 - 22:00 | 0 | -300 | 0 | 0 |
| 23.07.2013 22:00 - 23:00 | 0 | -300 | 0 | 0 |
| 23.07.2013 23:00 - 24:00 | 0 | -300 | 0 | 0 |
| 24.07.2013 00:00 - 01:00 | 0 | -500 | 0 | 0 |
| 24.07.2013 01:00 - 02:00 | 0 | -500 | 0 | 0 |
| 24.07.2013 02:00 - 03:00 | 0 | -500 | 0 | 0 |
| 24.07.2013 03:00 - 04:00 | 0 | -500 | 0 | 0 |
| 24.07.2013 04:00 - 05:00 | 0 | -500 | 0 | 0 |
| 24.07.2013 05:00 - 06:00 | 0 | -500 | 0 | 0 |
| 24.07.2013 06:00 - 07:00 | 0 | 0 | 0 | 0 |
| 24.07.2013 07:00 - 08:00 | 0 | 0 | 0 | 0 |
| 24.07.2013 08:00 - 09:00 | 0 | 0 | 0 | 0 |
| 24.07.2013 09:00 - 10:00 | 0 | 0 | 0 | 0 |
| 24.07.2013 10:00 - 11:00 | 0 | 0 | 0 | 0 |
| 24.07.2013 11:00 - 12:00 | 0 | 0 | 0 | 0 |
| 24.07.2013 12:00 - 13:00 | 0 | 0 | 0 | 0 |
| 24.07.2013 13:00 - 14:00 | 0 | 0 | 0 | 0 |
| 24.07.2013 14:00 - 15:00 | 0 | 0 | 0 | 0 |
| 24.07.2013 15:00 - 16:00 | 0 | 0 | 0 | 0 |
| 24.07.2013 16:00 - 17:00 | 0 | 0 | 0 | 0 |
| 24.07.2013 17:00 - 18:00 | 0 | 0 | 0 | 0 |
| 24.07.2013 18:00 - 19:00 | 0 | 0 | 0 | 0 |
| 24.07.2013 19:00 - 20:00 | 0 | 0 | 0 | 0 |
| 24.07.2013 20:00 - 21:00 | 0 | 0 | 0 | 0 |
| 24.07.2013 21:00 - 22:00 | 0 | 0 | 0 | 0 |
| 24.07.2013 22:00 - 23:00 | 0 | 0 | 0 | 0 |
| 24.07.2013 23:00 - 24:00 | 0 | 0 | 0 | 0 |
| 25.07.2013 00:00 - 01:00 | 0 | 0 | 0 | 0 |
| 25.07.2013 01:00 - 02:00 | 0 | -300 | 0 | 0 |
| 25.07.2013 02:00 - 03:00 | 0 | -300 | 0 | 0 |
| 25.07.2013 03:00 - 04:00 | 0 | -300 | 0 | 0 |
| 25.07.2013 04:00 - 05:00 | 0 | -300 | 0 | 0 |
| 25.07.2013 05:00 - 06:00 | 0 | -300 | 0 | 0 |
| 25.07.2013 06:00 - 07:00 | 0 | 0 | 0 | 0 |
| 25.07.2013 07:00 - 08:00 | 0 | 0 | 0 | 0 |
| 25.07.2013 08:00 - 09:00 | 0 | 0 | 0 | 0 |
| 25.07.2013 09:00 - 10:00 | 0 | 0 | 0 | 0 |
| 25.07.2013 10:00 - 11:00 | 0 | -100 | 0 | 0 |
| 25.07.2013 11:00 - 12:00 | 0 | -100 | 0 | 0 |
| 25.07.2013 12:00 - 13:00 | 0 | -200 | 0 | 0 |
| 25.07.2013 13:00 - 14:00 | 0 | -200 | 0 | 0 |
| 25.07.2013 14:00 - 15:00 | 0 | -200 | 0 | 0 |
| 25.07.2013 15:00 - 16:00 | 0 | -290 | 0 | 0 |
| 25.07.2013 16:00 - 17:00 | 0 | -390 | 0 | 0 |
| 25.07.2013 17:00 - 18:00 | 0 | -390 | 0 | 0 |
| 25.07.2013 18:00 - 19:00 | 0 | -390 | 0 | 0 |
| 25.07.2013 19:00 - 20:00 | 0 | -540 | 0 | 0 |
| 25.07.2013 20:00 - 21:00 | 0 | -540 | 0 | 0 |
| 25.07.2013 21:00 - 22:00 | 0 | -540 | 0 | 0 |
| 25.07.2013 22:00 - 23:00 | 0 | -540 | 0 | 0 |
| 25.07.2013 23:00 - 24:00 | 0 | -540 | 0 | 0 |
| 26.07.2013 00:00 - 01:00 | 0 | -540 | 0 | 0 |
| 26.07.2013 01:00 - 02:00 | 0 | -540 | 0 | 0 |
| 26.07.2013 02:00 - 03:00 | 0 | -540 | 0 | 0 |
| 26.07.2013 03:00 - 04:00 | 0 | -540 | 0 | 0 |
| 26.07.2013 04:00 - 05:00 | 0 | -540 | 0 | 0 |
| 26.07.2013 05:00 - 06:00 | 0 | -540 | 0 | 0 |
| 26.07.2013 06:00 - 07:00 | 0 | 0 | 0 | 0 |
| 26.07.2013 07:00 - 08:00 | 0 | 0 | 0 | 0 |
| 26.07.2013 08:00 - 09:00 | 0 | 0 | 0 | 0 |
| 26.07.2013 09:00 - 10:00 | 0 | 0 | 0 | 0 |
| 26.07.2013 10:00 - 11:00 | 0 | 0 | 0 | 0 |
| 26.07.2013 11:00 - 12:00 | 0 | 0 | 0 | 0 |
| 26.07.2013 12:00 - 13:00 | 0 | 0 | 0 | 0 |
| 26.07.2013 13:00 - 14:00 | 0 | 0 | 0 | 0 |
| 26.07.2013 14:00 - 15:00 | 0 | 0 | 0 | 0 |
| 26.07.2013 15:00 - 16:00 | 0 | 0 | 0 | 0 |
| 26.07.2013 16:00 - 17:00 | 0 | 0 | 0 | 0 |
| 26.07.2013 17:00 - 18:00 | 0 | 0 | 0 | 0 |
| 26.07.2013 18:00 - 19:00 | 0 | 0 | 0 | 0 |
| 26.07.2013 19:00 - 20:00 | 0 | 0 | 0 | 0 |
| 26.07.2013 20:00 - 21:00 | 0 | 0 | 0 | 0 |
| 26.07.2013 21:00 - 22:00 | 0 | 0 | 0 | 0 |
| 26.07.2013 22:00 - 23:00 | 0 | 0 | 0 | 0 |
| 26.07.2013 23:00 - 24:00 | 0 | 0 | 0 | 0 |
| 27.07.2013 00:00 - 01:00 | 0 | 0 | 0 | 0 |
| 27.07.2013 01:00 - 02:00 | 0 | 0 | 0 | 0 |
| 27.07.2013 02:00 - 03:00 | 0 | 0 | 0 | 0 |
| 27.07.2013 03:00 - 04:00 | 0 | -400 | 0 | 0 |
| 27.07.2013 04:00 - 05:00 | 0 | -400 | 0 | 0 |
| 27.07.2013 05:00 - 06:00 | 0 | -400 | 0 | 0 |
| 27.07.2013 06:00 - 07:00 | 0 | 0 | 0 | 0 |
| 27.07.2013 07:00 - 08:00 | 0 | 0 | 0 | 0 |
| 27.07.2013 08:00 - 09:00 | 0 | 0 | 0 | 0 |
| 27.07.2013 09:00 - 10:00 | 0 | 0 | 0 | 0 |
| 27.07.2013 10:00 - 11:00 | 0 | 0 | 0 | 0 |
| 27.07.2013 11:00 - 12:00 | 0 | -300 | 0 | 0 |
| 27.07.2013 12:00 - 13:00 | 0 | -300 | 0 | 0 |
| 27.07.2013 13:00 - 14:00 | 0 | -300 | 0 | 0 |
| 27.07.2013 14:00 - 15:00 | 0 | -300 | 0 | 0 |
| 27.07.2013 15:00 - 16:00 | 0 | -300 | 0 | 0 |
| 27.07.2013 16:00 - 17:00 | 0 | -300 | 0 | 0 |
| 27.07.2013 17:00 - 18:00 | 0 | -300 | 0 | 0 |
| 27.07.2013 18:00 - 19:00 | 0 | -300 | 0 | 0 |
| 27.07.2013 19:00 - 20:00 | 0 | -300 | 0 | 0 |
| 27.07.2013 20:00 - 21:00 | 0 | -300 | 0 | 0 |
| 27.07.2013 21:00 - 22:00 | 0 | -300 | 0 | 0 |
| 27.07.2013 22:00 - 23:00 | 0 | -300 | 0 | 0 |
| 27.07.2013 23:00 - 24:00 | 0 | -300 | 0 | 0 |
| 28.07.2013 00:00 - 01:00 | 0 | -300 | 0 | 0 |
| 28.07.2013 01:00 - 02:00 | 0 | -300 | 0 | 0 |
| 28.07.2013 02:00 - 03:00 | 0 | -300 | 0 | 0 |
| 28.07.2013 03:00 - 04:00 | 0 | -300 | 0 | 0 |
| 28.07.2013 04:00 - 05:00 | 0 | -700 | 0 | 0 |
| 28.07.2013 05:00 - 06:00 | 0 | -700 | 0 | 0 |
| 28.07.2013 06:00 - 07:00 | 0 | 0 | 0 | 0 |
| 28.07.2013 07:00 - 08:00 | 0 | 0 | 0 | 0 |
| 28.07.2013 08:00 - 09:00 | 0 | 0 | 0 | 0 |
| 28.07.2013 09:00 - 10:00 | 0 | 0 | 0 | 0 |
| 28.07.2013 10:00 - 11:00 | 0 | 0 | 0 | 0 |
| 28.07.2013 11:00 - 12:00 | 0 | 0 | 0 | 0 |
| 28.07.2013 12:00 - 13:00 | 0 | 0 | 0 | 0 |
| 28.07.2013 13:00 - 14:00 | 0 | 0 | 0 | 0 |
| 28.07.2013 14:00 - 15:00 | 0 | -300 | 0 | 0 |
| 28.07.2013 15:00 - 16:00 | 0 | -300 | 0 | 0 |
| 28.07.2013 16:00 - 17:00 | 0 | -300 | 0 | 0 |
| 28.07.2013 17:00 - 18:00 | 0 | -300 | 0 | 0 |
| 28.07.2013 18:00 - 19:00 | 0 | -300 | 0 | 0 |
| 28.07.2013 19:00 - 20:00 | 0 | -300 | 0 | 0 |
| 28.07.2013 20:00 - 21:00 | 0 | -300 | 0 | 0 |
| 28.07.2013 21:00 - 22:00 | 0 | -300 | 0 | 0 |
| 28.07.2013 22:00 - 23:00 | 0 | -550 | 0 | 0 |
| 28.07.2013 23:00 - 24:00 | 0 | -550 | 0 | 0 |
| 29.07.2013 00:00 - 01:00 | 0 | -850 | 0 | 0 |
| 29.07.2013 01:00 - 02:00 | 0 | -850 | 0 | 0 |
| 29.07.2013 02:00 - 03:00 | 0 | -850 | 0 | 0 |
| 29.07.2013 03:00 - 04:00 | 0 | -850 | 0 | 0 |
| 29.07.2013 04:00 - 05:00 | 0 | -850 | 0 | 0 |
| 29.07.2013 05:00 - 06:00 | 0 | -850 | 0 | 0 |
| 29.07.2013 06:00 - 07:00 | 0 | 0 | 0 | 0 |
| 29.07.2013 07:00 - 08:00 | 0 | 0 | 0 | 0 |
| 29.07.2013 08:00 - 09:00 | 0 | 0 | 0 | 0 |
| 29.07.2013 09:00 - 10:00 | 0 | 0 | 0 | 0 |
| 29.07.2013 10:00 - 11:00 | 0 | 0 | 0 | 0 |
| 29.07.2013 11:00 - 12:00 | 0 | 0 | 0 | 0 |
| 29.07.2013 12:00 - 13:00 | 0 | 0 | 0 | 0 |
| 29.07.2013 13:00 - 14:00 | 0 | 0 | 0 | 0 |
| 29.07.2013 14:00 - 15:00 | 0 | 0 | 0 | 0 |
| 29.07.2013 15:00 - 16:00 | 0 | 0 | 0 | 0 |
| 29.07.2013 16:00 - 17:00 | 0 | 0 | 0 | 0 |
| 29.07.2013 17:00 - 18:00 | 0 | 0 | 0 | 0 |
| 29.07.2013 18:00 - 19:00 | 0 | 0 | 0 | 0 |
| 29.07.2013 19:00 - 20:00 | 0 | 0 | 0 | 0 |
| 29.07.2013 20:00 - 21:00 | 0 | 0 | 0 | 0 |
| 29.07.2013 21:00 - 22:00 | 0 | 0 | 0 | 0 |
| 29.07.2013 22:00 - 23:00 | 0 | 0 | 0 | 0 |
| 29.07.2013 23:00 - 24:00 | 0 | 0 | 0 | 0 |
| 30.07.2013 00:00 - 01:00 | 0 | 0 | 0 | 0 |
| 30.07.2013 01:00 - 02:00 | 0 | 0 | 0 | 0 |
| 30.07.2013 02:00 - 03:00 | 0 | -300 | 0 | 0 |
| 30.07.2013 03:00 - 04:00 | 0 | -300 | 0 | 0 |
| 30.07.2013 04:00 - 05:00 | 0 | -300 | 0 | 0 |
| 30.07.2013 05:00 - 06:00 | 0 | -300 | 0 | 0 |
| 30.07.2013 06:00 - 07:00 | 0 | 0 | 0 | 0 |
| 30.07.2013 07:00 - 08:00 | 0 | 0 | 0 | 0 |
| 30.07.2013 08:00 - 09:00 | 0 | 0 | 0 | 0 |
| 30.07.2013 09:00 - 10:00 | 0 | 0 | 0 | 0 |
| 30.07.2013 10:00 - 11:00 | 0 | 0 | 0 | 0 |
| 30.07.2013 11:00 - 12:00 | 0 | 0 | 0 | 0 |
| 30.07.2013 12:00 - 13:00 | 0 | -200 | 0 | 0 |
| 30.07.2013 13:00 - 14:00 | 0 | -200 | 0 | 0 |
| 30.07.2013 14:00 - 15:00 | 0 | -200 | 0 | 0 |
| 30.07.2013 15:00 - 16:00 | 0 | -200 | 0 | 0 |
| 30.07.2013 16:00 - 17:00 | 0 | -400 | 0 | 0 |
| 30.07.2013 17:00 - 18:00 | 0 | -400 | 0 | 0 |
| 30.07.2013 18:00 - 19:00 | 0 | -400 | 0 | 0 |
| 30.07.2013 19:00 - 20:00 | 0 | -400 | 0 | 0 |
| 30.07.2013 20:00 - 21:00 | 0 | -400 | 0 | 0 |
| 30.07.2013 21:00 - 22:00 | 0 | -400 | 0 | 0 |
| 30.07.2013 22:00 - 23:00 | 0 | -400 | 0 | 0 |
| 30.07.2013 23:00 - 24:00 | 0 | -400 | 0 | 0 |
| 31.07.2013 00:00 - 01:00 | 0 | -400 | 0 | 0 |
| 31.07.2013 01:00 - 02:00 | 0 | -400 | 0 | 0 |
| 31.07.2013 02:00 - 03:00 | 0 | -400 | 0 | 0 |
| 31.07.2013 03:00 - 04:00 | 0 | -400 | 0 | 0 |
| 31.07.2013 04:00 - 05:00 | 0 | -400 | 0 | 0 |
| 31.07.2013 05:00 - 06:00 | 0 | -400 | 0 | 0 |